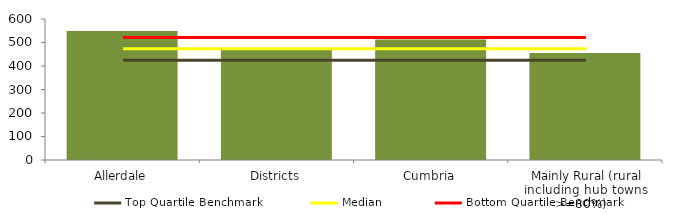
| Category | Block Data |
|---|---|
| Allerdale | 548.6 |
| Districts | 470.748 |
| Cumbria | 512.317 |
|  Mainly Rural (rural including hub towns >=80%)   | 455.149 |